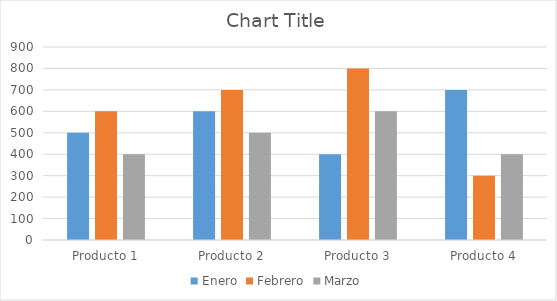
| Category | Enero | Febrero | Marzo |
|---|---|---|---|
| Producto 1 | 500 | 600 | 400 |
| Producto 2 | 600 | 700 | 500 |
| Producto 3 | 400 | 800 | 600 |
| Producto 4 | 700 | 300 | 400 |